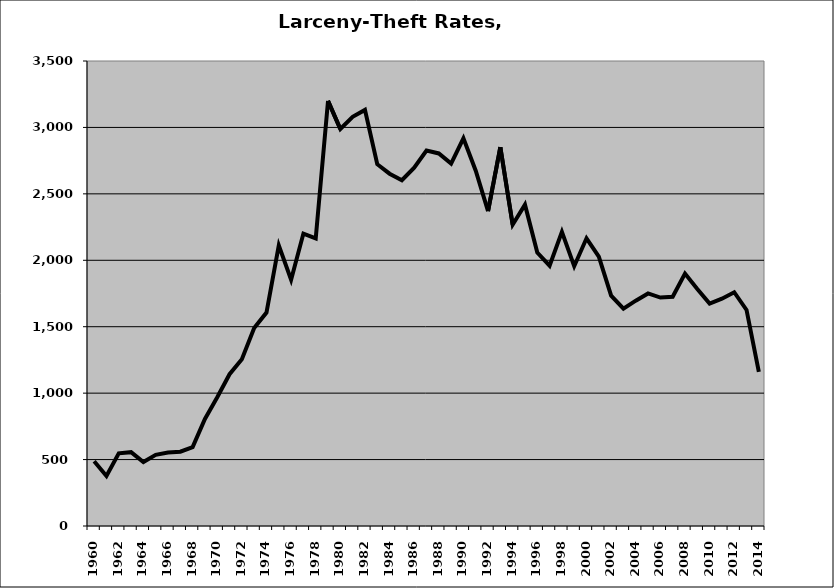
| Category | Larceny-Theft |
|---|---|
| 1960.0 | 486.815 |
| 1961.0 | 376.962 |
| 1962.0 | 546.923 |
| 1963.0 | 555.641 |
| 1964.0 | 481.174 |
| 1965.0 | 536.02 |
| 1966.0 | 552.593 |
| 1967.0 | 559.233 |
| 1968.0 | 593.602 |
| 1969.0 | 805.467 |
| 1970.0 | 968.673 |
| 1971.0 | 1142.576 |
| 1972.0 | 1255.844 |
| 1973.0 | 1489.871 |
| 1974.0 | 1606.596 |
| 1975.0 | 2112.102 |
| 1976.0 | 1853.151 |
| 1977.0 | 2201.035 |
| 1978.0 | 2164.887 |
| 1979.0 | 3200 |
| 1980.0 | 2988.075 |
| 1981.0 | 3079.612 |
| 1982.0 | 3131.783 |
| 1983.0 | 2723.048 |
| 1984.0 | 2651.698 |
| 1985.0 | 2602.617 |
| 1986.0 | 2697.412 |
| 1987.0 | 2825.73 |
| 1988.0 | 2804.137 |
| 1989.0 | 2727.69 |
| 1990.0 | 2918.484 |
| 1991.0 | 2673.898 |
| 1992.0 | 2369.649 |
| 1993.0 | 2851.215 |
| 1994.0 | 2267.931 |
| 1995.0 | 2418.803 |
| 1996.0 | 2058.404 |
| 1997.0 | 1959.593 |
| 1998.0 | 2213.875 |
| 1999.0 | 1955.401 |
| 2000.0 | 2165.476 |
| 2001.0 | 2027.153 |
| 2002.0 | 1733.268 |
| 2003.0 | 1635.927 |
| 2004.0 | 1696.143 |
| 2005.0 | 1750.358 |
| 2006.0 | 1719.645 |
| 2007.0 | 1725.542 |
| 2008.0 | 1900.333 |
| 2009.0 | 1783.646 |
| 2010.0 | 1673.855 |
| 2011.0 | 1710.842 |
| 2012.0 | 1759.557 |
| 2013.0 | 1626.054 |
| 2014.0 | 1160.779 |